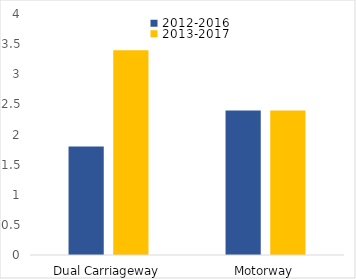
| Category | 2012-2016 | 2013-2017 |
|---|---|---|
| Dual Carriageway | 1.8 | 3.4 |
| Motorway | 2.4 | 2.4 |